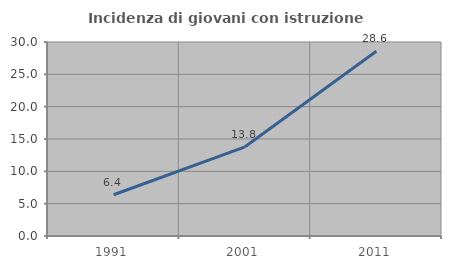
| Category | Incidenza di giovani con istruzione universitaria |
|---|---|
| 1991.0 | 6.383 |
| 2001.0 | 13.793 |
| 2011.0 | 28.571 |